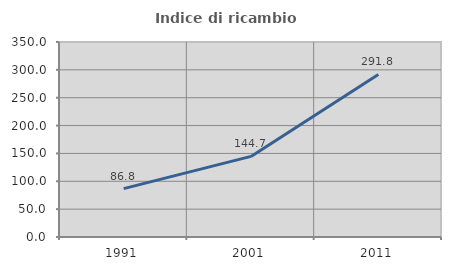
| Category | Indice di ricambio occupazionale  |
|---|---|
| 1991.0 | 86.792 |
| 2001.0 | 144.686 |
| 2011.0 | 291.76 |